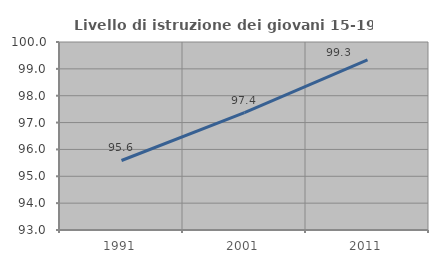
| Category | Livello di istruzione dei giovani 15-19 anni |
|---|---|
| 1991.0 | 95.588 |
| 2001.0 | 97.368 |
| 2011.0 | 99.333 |